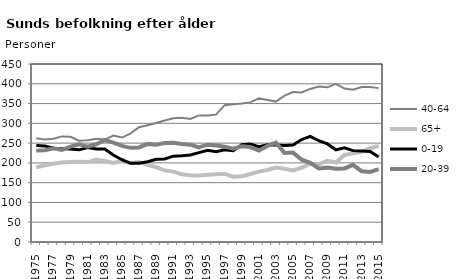
| Category | 40-64 | 65+ | 0-19 | 20-39 |
|---|---|---|---|---|
| 1975.0 | 262 | 189 | 244 | 231 |
| 1976.0 | 259 | 194 | 243 | 232 |
| 1977.0 | 261 | 198 | 237 | 237 |
| 1978.0 | 267 | 201 | 236 | 233 |
| 1979.0 | 266 | 202 | 235 | 241 |
| 1980.0 | 256 | 203 | 233 | 247 |
| 1981.0 | 257 | 202 | 239 | 241 |
| 1982.0 | 261 | 208 | 235 | 247 |
| 1983.0 | 259 | 205 | 235 | 258 |
| 1984.0 | 269 | 200 | 220 | 251 |
| 1985.0 | 264 | 205 | 208 | 243 |
| 1986.0 | 274 | 200 | 199 | 238 |
| 1987.0 | 290 | 202 | 199 | 239 |
| 1988.0 | 295 | 195 | 203 | 248 |
| 1989.0 | 301 | 189 | 209 | 246 |
| 1990.0 | 307 | 181 | 210 | 250 |
| 1991.0 | 313 | 178 | 217 | 251 |
| 1992.0 | 314 | 171 | 218 | 248 |
| 1993.0 | 311 | 169 | 220 | 246 |
| 1994.0 | 320 | 168 | 226 | 239 |
| 1995.0 | 320 | 170 | 232 | 246 |
| 1996.0 | 322 | 171 | 228 | 244 |
| 1997.0 | 346 | 172 | 233 | 241 |
| 1998.0 | 348 | 165 | 231 | 236 |
| 1999.0 | 350 | 166 | 246 | 242 |
| 2000.0 | 353 | 172 | 248 | 240 |
| 2001.0 | 363 | 178 | 241 | 231 |
| 2002.0 | 359 | 182 | 246 | 243 |
| 2003.0 | 355 | 188 | 245 | 251 |
| 2004.0 | 370 | 185 | 244 | 225 |
| 2005.0 | 379 | 181 | 245 | 226 |
| 2006.0 | 378 | 188 | 259 | 208 |
| 2007.0 | 387 | 198 | 267 | 200 |
| 2008.0 | 393 | 196 | 256 | 186 |
| 2009.0 | 391 | 205 | 248 | 188 |
| 2010.0 | 400 | 201 | 233 | 185 |
| 2011.0 | 388 | 220 | 238 | 186 |
| 2012.0 | 385 | 224 | 231 | 195 |
| 2013.0 | 392 | 228 | 230 | 179 |
| 2014.0 | 392 | 237 | 229 | 177 |
| 2015.0 | 389 | 243 | 215 | 184 |